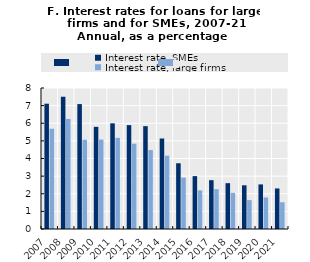
| Category | Interest rate, SMEs | Interest rate, large firms |
|---|---|---|
| 2007.0 | 7.109 | 5.687 |
| 2008.0 | 7.508 | 6.247 |
| 2009.0 | 7.087 | 5.062 |
| 2010.0 | 5.797 | 5.074 |
| 2011.0 | 5.996 | 5.17 |
| 2012.0 | 5.894 | 4.839 |
| 2013.0 | 5.835 | 4.478 |
| 2014.0 | 5.135 | 4.161 |
| 2015.0 | 3.73 | 2.92 |
| 2016.0 | 3 | 2.19 |
| 2017.0 | 2.77 | 2.26 |
| 2018.0 | 2.6 | 2.05 |
| 2019.0 | 2.48 | 1.64 |
| 2020.0 | 2.53 | 1.79 |
| 2021.0 | 2.3 | 1.516 |